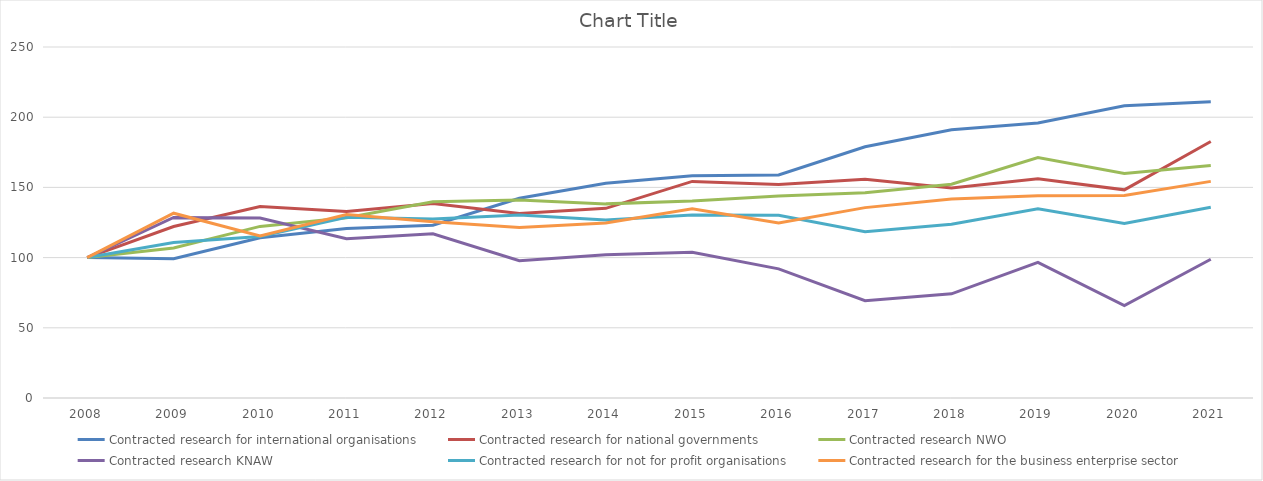
| Category | Contracted research for international organisations | Contracted research for national governments | Contracted research NWO | Contracted research KNAW | Contracted research for not for profit organisations | Contracted research for the business enterprise sector |
|---|---|---|---|---|---|---|
| 2008.0 | 100 | 100 | 100 | 100 | 100 | 100 |
| 2009.0 | 99.189 | 122.144 | 106.817 | 128.598 | 110.731 | 131.63 |
| 2010.0 | 114.149 | 136.372 | 122.232 | 128.13 | 115.008 | 115.482 |
| 2011.0 | 120.732 | 132.753 | 128.402 | 113.399 | 128.759 | 130.673 |
| 2012.0 | 123.039 | 138.484 | 139.707 | 116.942 | 127.459 | 125.593 |
| 2013.0 | 142.22 | 131.403 | 141.031 | 97.83 | 130.305 | 121.413 |
| 2014.0 | 152.96 | 135.095 | 138.266 | 102.038 | 126.706 | 124.712 |
| 2015.0 | 158.279 | 154.264 | 140.232 | 103.727 | 130.325 | 134.846 |
| 2016.0 | 158.86 | 152.108 | 143.909 | 91.981 | 130.207 | 124.638 |
| 2017.0 | 178.967 | 155.848 | 146.24 | 69.322 | 118.493 | 135.598 |
| 2018.0 | 191.019 | 149.662 | 152.304 | 74.183 | 123.704 | 141.741 |
| 2019.0 | 195.808 | 156.188 | 171.207 | 96.584 | 134.785 | 144.121 |
| 2020.0 | 208.076 | 148.256 | 159.854 | 65.851 | 124.24 | 144.286 |
| 2021.0 | 210.917 | 182.646 | 165.54 | 98.801 | 135.93 | 154.284 |